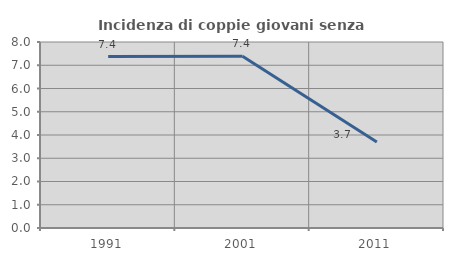
| Category | Incidenza di coppie giovani senza figli |
|---|---|
| 1991.0 | 7.374 |
| 2001.0 | 7.388 |
| 2011.0 | 3.702 |